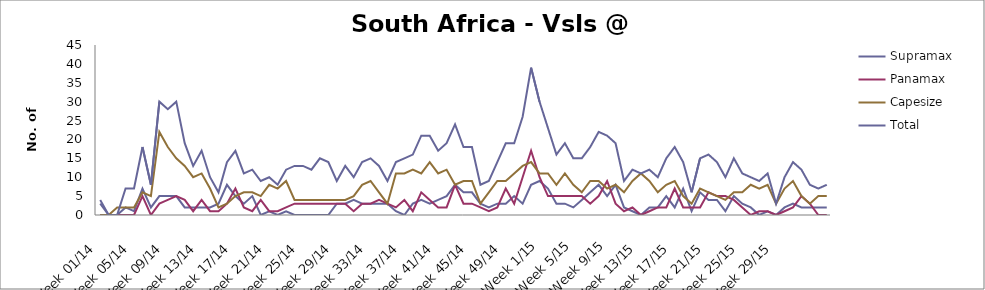
| Category | Supramax | Panamax | Capesize | Total |
|---|---|---|---|---|
| Week 01/14 | 3 | 0 | 0 | 4 |
| Week 02/14 | 0 | 0 | 0 | 0 |
| Week 03/14 | 0 | 0 | 2 | 0 |
| Week 04/14 | 2 | 0 | 2 | 7 |
| Week 05/14 | 1 | 0 | 2 | 7 |
| Week 06/14 | 7 | 5 | 6 | 18 |
| Week 07/14 | 2 | 0 | 5 | 8 |
| Week 08/14 | 5 | 3 | 22 | 30 |
| Week 09/14 | 5 | 4 | 18 | 28 |
| Week 10/14 | 5 | 5 | 15 | 30 |
| Week 11/14 | 2 | 4 | 13 | 19 |
| Week 12/14 | 2 | 1 | 10 | 13 |
| Week 13/14 | 2 | 4 | 11 | 17 |
| Week 14/14 | 2 | 1 | 7 | 10 |
| Week 15/14 | 3 | 1 | 2 | 6 |
| Week 16/14 | 8 | 3 | 3 | 14 |
| Week 17/14 | 5 | 7 | 5 | 17 |
| Week 18/14 | 3 | 2 | 6 | 11 |
| Week 19/14 | 5 | 1 | 6 | 12 |
| Week 20/14 | 0 | 4 | 5 | 9 |
| Week 21/14 | 1 | 1 | 8 | 10 |
| Week 22/14 | 0 | 1 | 7 | 8 |
| Week 23/14 | 1 | 2 | 9 | 12 |
| Week 24/14 | 0 | 3 | 4 | 13 |
| Week 25/14 | 0 | 3 | 4 | 13 |
| Week 26/14 | 0 | 3 | 4 | 12 |
| Week 27/14 | 0 | 3 | 4 | 15 |
| Week 28/14 | 0 | 3 | 4 | 14 |
| Week 29/14 | 3 | 3 | 4 | 9 |
| Week 30/14 | 3 | 3 | 4 | 13 |
| Week 31/14 | 4 | 1 | 5 | 10 |
| Week 32/14 | 3 | 3 | 8 | 14 |
| Week 33/14 | 3 | 3 | 9 | 15 |
| Week 34/14 | 3 | 4 | 6 | 13 |
| Week 35/14 | 3 | 3 | 3 | 9 |
| Week 36/14 | 1 | 2 | 11 | 14 |
| Week 37/14 | 0 | 4 | 11 | 15 |
| Week 38/14 | 3 | 1 | 12 | 16 |
| Week 39/14 | 4 | 6 | 11 | 21 |
| Week 40/14 | 3 | 4 | 14 | 21 |
| Week 41/14 | 4 | 2 | 11 | 17 |
| Week 42/14 | 5 | 2 | 12 | 19 |
| Week 43/14 | 8 | 8 | 8 | 24 |
| Week 44/14 | 6 | 3 | 9 | 18 |
| Week 45/14 | 6 | 3 | 9 | 18 |
| Week 46/14 | 3 | 2 | 3 | 8 |
| Week 47/14 | 2 | 1 | 6 | 9 |
| Week 48/14 | 3 | 2 | 9 | 14 |
| Week 49/14 | 3 | 7 | 9 | 19 |
| Week 50/14 | 5 | 3 | 11 | 19 |
| Week 51/14 | 3 | 10 | 13 | 26 |
| Week 52/14 | 8 | 17 | 14 | 39 |
| Week 1/15 | 9 | 10 | 11 | 30 |
| Week 2/15 | 7 | 5 | 11 | 23 |
| Week 3/15 | 3 | 5 | 8 | 16 |
| Week 4/15 | 3 | 5 | 11 | 19 |
| Week 5/15 | 2 | 5 | 8 | 15 |
| Week 6/15 | 4 | 5 | 6 | 15 |
| Week 7/15 | 6 | 3 | 9 | 18 |
| Week 8/15 | 8 | 5 | 9 | 22 |
| Week 9/15 | 5 | 9 | 7 | 21 |
| Week 10/15 | 8 | 3 | 8 | 19 |
| Week 11/15 | 2 | 1 | 6 | 9 |
| Week 12/15 | 1 | 2 | 9 | 12 |
| Week 13/15 | 0 | 0 | 11 | 11 |
| Week 14/15 | 2 | 1 | 9 | 12 |
| Week 15/15 | 2 | 2 | 6 | 10 |
| Week 16/15 | 5 | 2 | 8 | 15 |
| Week 17/15 | 2 | 7 | 9 | 18 |
| Week 18/15 | 7 | 2 | 5 | 14 |
| Week 19/15 | 1 | 2 | 3 | 6 |
| Week 20/15 | 6 | 2 | 7 | 15 |
| Week 21/15 | 4 | 6 | 6 | 16 |
| Week 22/15 | 4 | 5 | 5 | 14 |
| Week 23/15 | 1 | 5 | 4 | 10 |
| Week 24/15 | 5 | 4 | 6 | 15 |
| Week 25/15 | 3 | 2 | 6 | 11 |
| Week 26/15 | 2 | 0 | 8 | 10 |
| Week 27/15 | 0 | 1 | 7 | 9 |
| Week 28/15 | 1 | 1 | 8 | 11 |
| Week 29/15 | 0 | 0 | 3 | 3 |
| Week 30/15 | 2 | 1 | 7 | 10 |
| Week 31/15 | 3 | 2 | 9 | 14 |